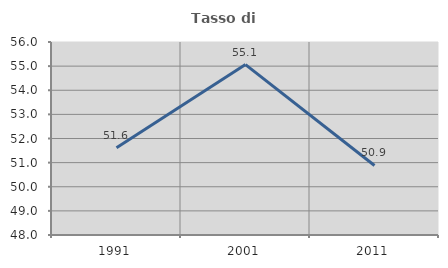
| Category | Tasso di occupazione   |
|---|---|
| 1991.0 | 51.618 |
| 2001.0 | 55.065 |
| 2011.0 | 50.881 |